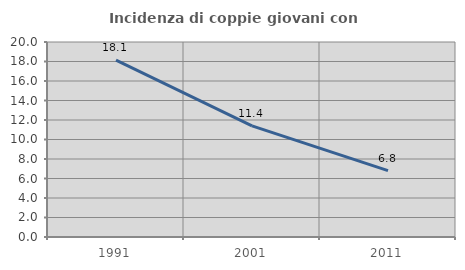
| Category | Incidenza di coppie giovani con figli |
|---|---|
| 1991.0 | 18.135 |
| 2001.0 | 11.397 |
| 2011.0 | 6.807 |